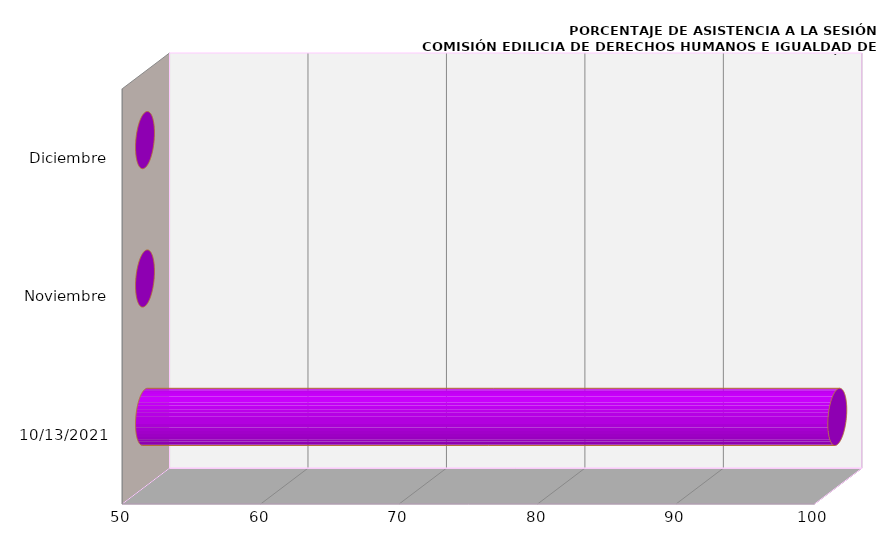
| Category | Series 0 |
|---|---|
| 13/10/2021 | 100 |
| Noviembre | 0 |
| Diciembre | 0 |